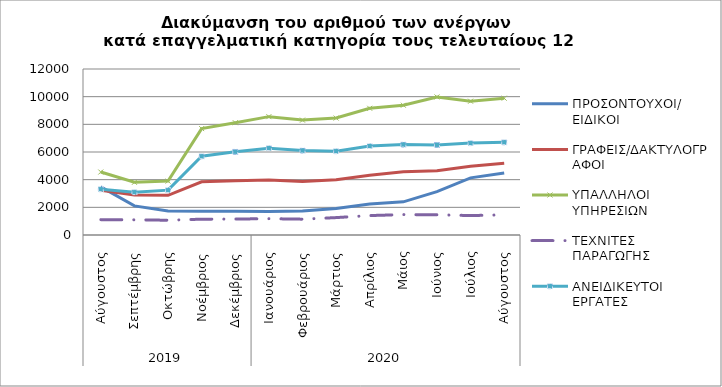
| Category | ΠΡΟΣΟΝΤΟΥΧΟΙ/  ΕΙΔΙΚΟΙ | ΓΡΑΦΕΙΣ/ΔΑΚΤΥΛΟΓΡΑΦΟΙ | ΥΠΑΛΛΗΛΟΙ ΥΠΗΡΕΣΙΩΝ | ΤΕΧΝΙΤΕΣ ΠΑΡΑΓΩΓΗΣ | ΑΝΕΙΔΙΚΕΥΤΟΙ ΕΡΓΑΤΕΣ |
|---|---|---|---|---|---|
| 0 | 3481 | 3236 | 4551 | 1111 | 3312 |
| 1 | 2104 | 2890 | 3809 | 1097 | 3094 |
| 2 | 1735 | 2865 | 3896 | 1068 | 3242 |
| 3 | 1719 | 3843 | 7692 | 1144 | 5690 |
| 4 | 1724 | 3914 | 8117 | 1155 | 6012 |
| 5 | 1702 | 3980 | 8556 | 1179 | 6279 |
| 6 | 1728 | 3859 | 8305 | 1145 | 6104 |
| 7 | 1918 | 4001 | 8454 | 1258 | 6062 |
| 8 | 2246 | 4325 | 9159 | 1405 | 6433 |
| 9 | 2398 | 4567 | 9381 | 1474 | 6537 |
| 10 | 3138 | 4651 | 9981 | 1463 | 6510 |
| 11 | 4130 | 4971 | 9672 | 1404 | 6642 |
| 12 | 4486 | 5193 | 9889 | 1458 | 6701 |